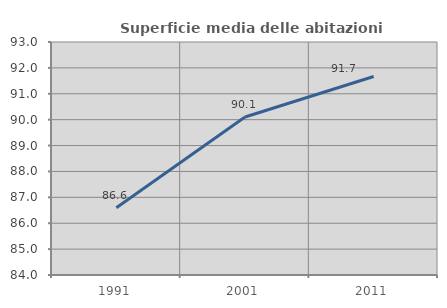
| Category | Superficie media delle abitazioni occupate |
|---|---|
| 1991.0 | 86.6 |
| 2001.0 | 90.105 |
| 2011.0 | 91.667 |